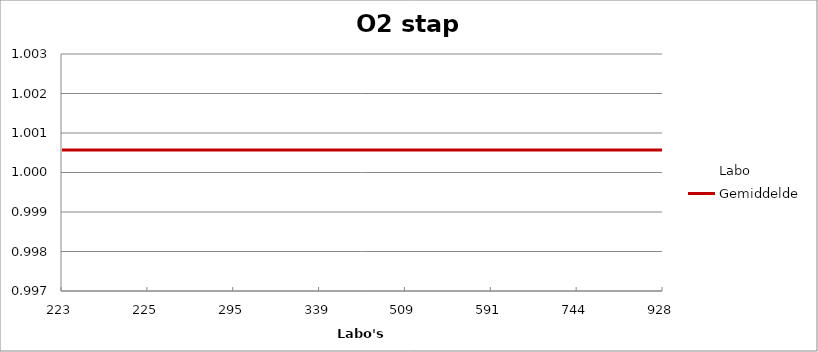
| Category | Labo | Gemiddelde |
|---|---|---|
| 223.0 | 1 | 1.001 |
| 225.0 | 1.002 | 1.001 |
| 295.0 | 1 | 1.001 |
| 339.0 | 1.003 | 1.001 |
| 509.0 | 0.999 | 1.001 |
| 591.0 | 1 | 1.001 |
| 744.0 | 0.999 | 1.001 |
| 928.0 | 1.002 | 1.001 |